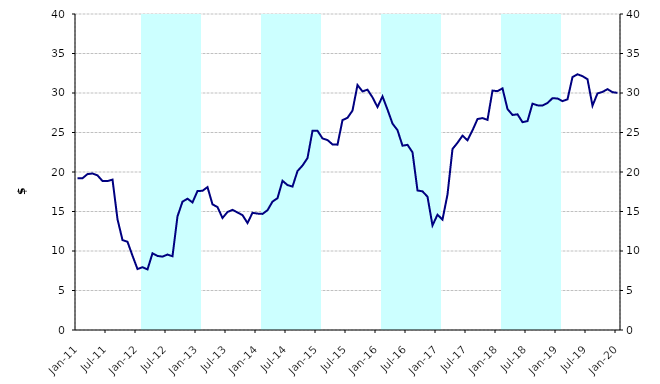
| Category | Series 1 |
|---|---|
| 0 | 0 |
| 1900-01-01 | 0 |
| 1900-01-02 | 0 |
| 1900-01-03 | 0 |
| 1900-01-04 | 0 |
| 1900-01-05 | 0 |
| 1900-01-06 | 0 |
| 1900-01-07 | 0 |
| 1900-01-08 | 0 |
| 1900-01-09 | 0 |
| 1900-01-10 | 0 |
| 1900-01-11 | 0 |
| 1900-01-12 | 0 |
| 1900-01-13 | 40000000 |
| 1900-01-14 | 40000000 |
| 1900-01-15 | 40000000 |
| 1900-01-16 | 40000000 |
| 1900-01-17 | 40000000 |
| 1900-01-18 | 40000000 |
| 1900-01-19 | 40000000 |
| 1900-01-20 | 40000000 |
| 1900-01-21 | 40000000 |
| 1900-01-22 | 40000000 |
| 1900-01-23 | 40000000 |
| 1900-01-24 | 40000000 |
| 1900-01-25 | 0 |
| 1900-01-26 | 0 |
| 1900-01-27 | 0 |
| 1900-01-28 | 0 |
| 1900-01-29 | 0 |
| 1900-01-30 | 0 |
| 1900-01-31 | 0 |
| 1900-02-01 | 0 |
| 1900-02-02 | 0 |
| 1900-02-03 | 0 |
| 1900-02-04 | 0 |
| 1900-02-05 | 0 |
| 1900-02-06 | 40000000 |
| 1900-02-07 | 40000000 |
| 1900-02-08 | 40000000 |
| 1900-02-09 | 40000000 |
| 1900-02-10 | 40000000 |
| 1900-02-11 | 40000000 |
| 1900-02-12 | 40000000 |
| 1900-02-13 | 40000000 |
| 1900-02-14 | 40000000 |
| 1900-02-15 | 40000000 |
| 1900-02-16 | 40000000 |
| 1900-02-17 | 40000000 |
| 1900-02-18 | 0 |
| 1900-02-19 | 0 |
| 1900-02-20 | 0 |
| 1900-02-21 | 0 |
| 1900-02-22 | 0 |
| 1900-02-23 | 0 |
| 1900-02-24 | 0 |
| 1900-02-25 | 0 |
| 1900-02-26 | 0 |
| 1900-02-27 | 0 |
| 1900-02-28 | 0 |
| 1900-02-28 | 0 |
| 1900-03-01 | 40000000 |
| 1900-03-02 | 40000000 |
| 1900-03-03 | 40000000 |
| 1900-03-04 | 40000000 |
| 1900-03-05 | 40000000 |
| 1900-03-06 | 40000000 |
| 1900-03-07 | 40000000 |
| 1900-03-08 | 40000000 |
| 1900-03-09 | 40000000 |
| 1900-03-10 | 40000000 |
| 1900-03-11 | 40000000 |
| 1900-03-12 | 40000000 |
| 1900-03-13 | 0 |
| 1900-03-14 | 0 |
| 1900-03-15 | 0 |
| 1900-03-16 | 0 |
| 1900-03-17 | 0 |
| 1900-03-18 | 0 |
| 1900-03-19 | 0 |
| 1900-03-20 | 0 |
| 1900-03-21 | 0 |
| 1900-03-22 | 0 |
| 1900-03-23 | 0 |
| 1900-03-24 | 0 |
| 1900-03-25 | 40000000 |
| 1900-03-26 | 40000000 |
| 1900-03-27 | 40000000 |
| 1900-03-28 | 40000000 |
| 1900-03-29 | 40000000 |
| 1900-03-30 | 40000000 |
| 1900-03-31 | 40000000 |
| 1900-04-01 | 40000000 |
| 1900-04-02 | 40000000 |
| 1900-04-03 | 40000000 |
| 1900-04-04 | 40000000 |
| 1900-04-05 | 40000000 |
| 1900-04-06 | 0 |
| 1900-04-07 | 0 |
| 1900-04-08 | 0 |
| 1900-04-09 | 0 |
| 1900-04-10 | 0 |
| 1900-04-11 | 0 |
| 1900-04-12 | 0 |
| 1900-04-13 | 0 |
| 1900-04-14 | 0 |
| 1900-04-15 | 0 |
| 1900-04-16 | 0 |
| 1900-04-17 | 0 |